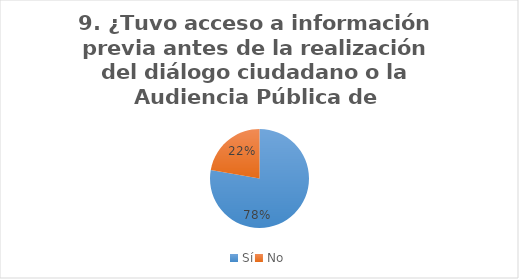
| Category | Series 0 |
|---|---|
| Sí | 7 |
| No | 2 |